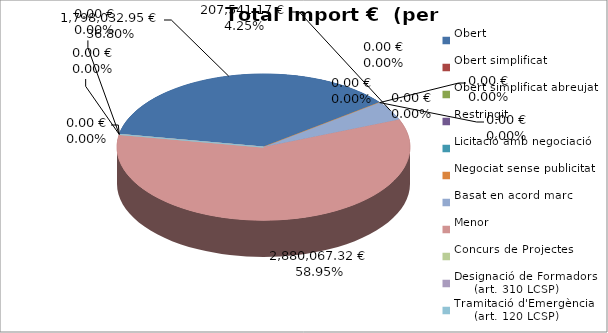
| Category | Total preu
(amb IVA) |
|---|---|
| Obert | 1798032.95 |
| Obert simplificat | 0 |
| Obert simplificat abreujat | 0 |
| Restringit | 0 |
| Licitació amb negociació | 0 |
| Negociat sense publicitat | 0 |
| Basat en acord marc | 207541.17 |
| Menor | 2880067.32 |
| Concurs de Projectes | 0 |
| Designació de Formadors
     (art. 310 LCSP) | 0 |
| Tramitació d'Emergència
     (art. 120 LCSP) | 0 |